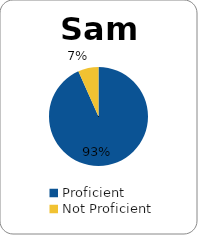
| Category | Series 0 |
|---|---|
| Proficient | 0.933 |
| Not Proficient | 0.067 |